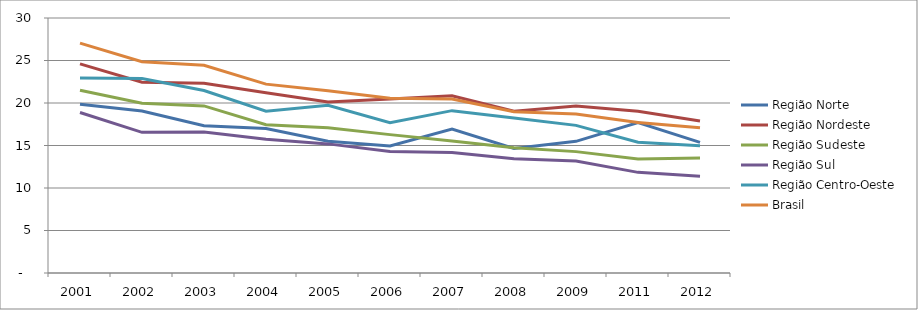
| Category | Região Norte | Região Nordeste | Região Sudeste | Região Sul | Região Centro-Oeste | Brasil |
|---|---|---|---|---|---|---|
| 2001.0 | 19.85 | 24.61 | 21.5 | 18.88 | 22.95 | 27.04 |
| 2002.0 | 19.05 | 22.44 | 19.98 | 16.55 | 22.88 | 24.86 |
| 2003.0 | 17.32 | 22.31 | 19.66 | 16.6 | 21.47 | 24.44 |
| 2004.0 | 17 | 21.2 | 17.44 | 15.73 | 19.03 | 22.22 |
| 2005.0 | 15.51 | 20.11 | 17.09 | 15.19 | 19.73 | 21.43 |
| 2006.0 | 14.94 | 20.48 | 16.28 | 14.3 | 17.68 | 20.56 |
| 2007.0 | 16.94 | 20.85 | 15.54 | 14.17 | 19.1 | 20.46 |
| 2008.0 | 14.66 | 19.04 | 14.74 | 13.44 | 18.23 | 18.98 |
| 2009.0 | 15.49 | 19.64 | 14.28 | 13.18 | 17.37 | 18.7 |
| 2011.0 | 17.69 | 19.04 | 13.42 | 11.84 | 15.38 | 17.71 |
| 2012.0 | 15.36 | 17.89 | 13.52 | 11.39 | 14.97 | 17.09 |